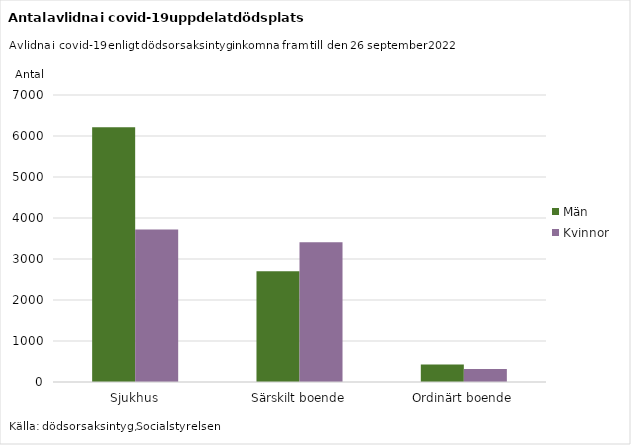
| Category | Män | Kvinnor |
|---|---|---|
| Sjukhus | 6215 | 3719 |
| Särskilt boende | 2699 | 3410 |
| Ordinärt boende | 427 | 318 |